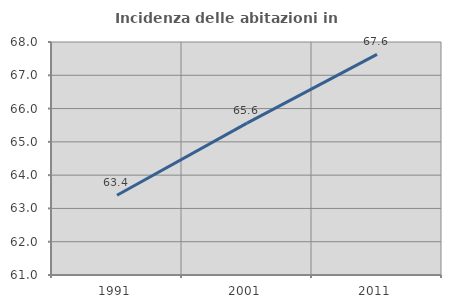
| Category | Incidenza delle abitazioni in proprietà  |
|---|---|
| 1991.0 | 63.396 |
| 2001.0 | 65.563 |
| 2011.0 | 67.628 |